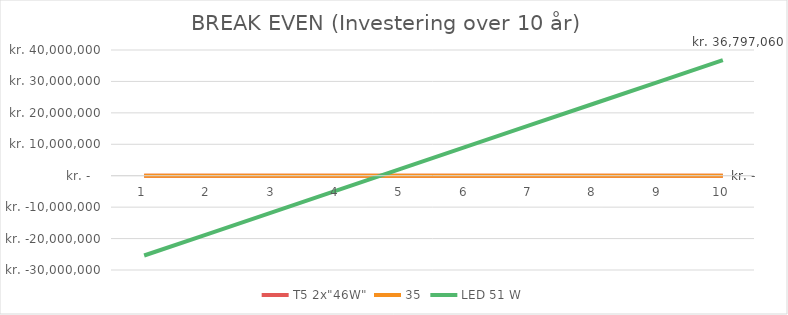
| Category | T5 2x"46W" | 35 | 19W Rax (on/off) | LED 51 W |
|---|---|---|---|---|
| 0 | 0 | 0 |  | -25386099.082 |
| 1 | 0 | 0 |  | -18476859.165 |
| 2 | 0 | 0 |  | -11567619.247 |
| 3 | 0 | 0 |  | -4658379.33 |
| 4 | 0 | 0 |  | 2250860.588 |
| 5 | 0 | 0 |  | 9160100.506 |
| 6 | 0 | 0 |  | 16069340.423 |
| 7 | 0 | 0 |  | 22978580.341 |
| 8 | 0 | 0 |  | 29887820.259 |
| 9 | 0 | 0 |  | 36797060.176 |